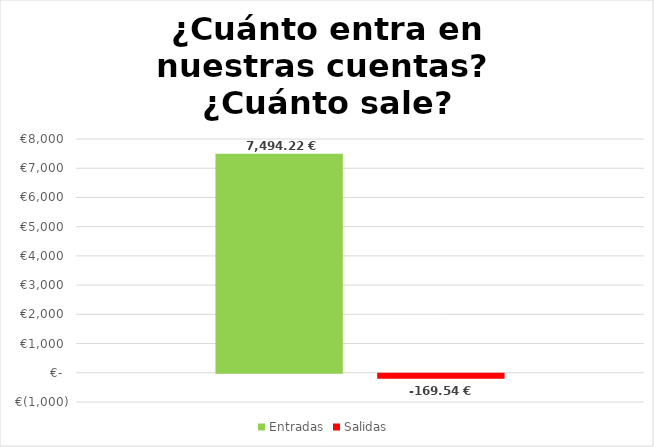
| Category | Entradas | Salidas  |
|---|---|---|
| 0 | 7494.22 | -169.54 |